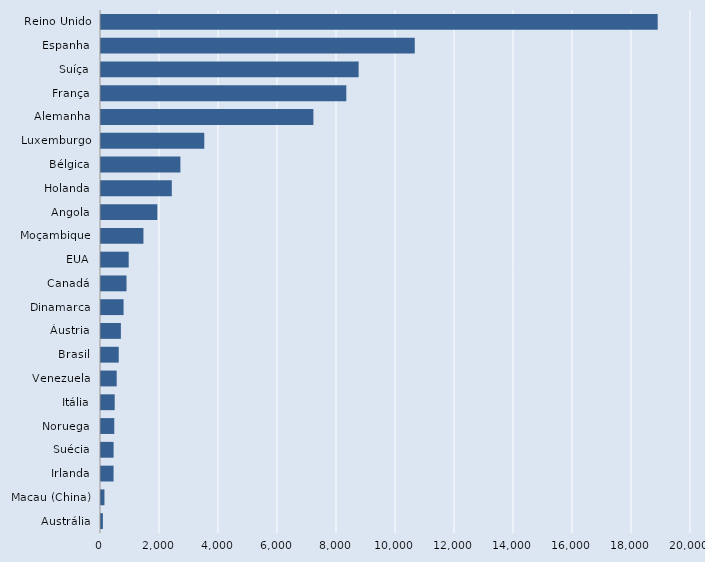
| Category | Series 0 |
|---|---|
| Austrália | 65 |
| Macau (China) | 117 |
| Irlanda | 426 |
| Suécia | 427 |
| Noruega | 450 |
| Itália | 465 |
| Venezuela | 532 |
| Brasil | 601 |
| Áustria | 674 |
| Dinamarca | 765 |
| Canadá | 865 |
| EUA | 939 |
| Moçambique | 1439 |
| Angola | 1910 |
| Holanda | 2400 |
| Bélgica | 2691 |
| Luxemburgo | 3501 |
| Alemanha | 7200 |
| França | 8316 |
| Suíça | 8733 |
| Espanha | 10636 |
| Reino Unido | 18871 |